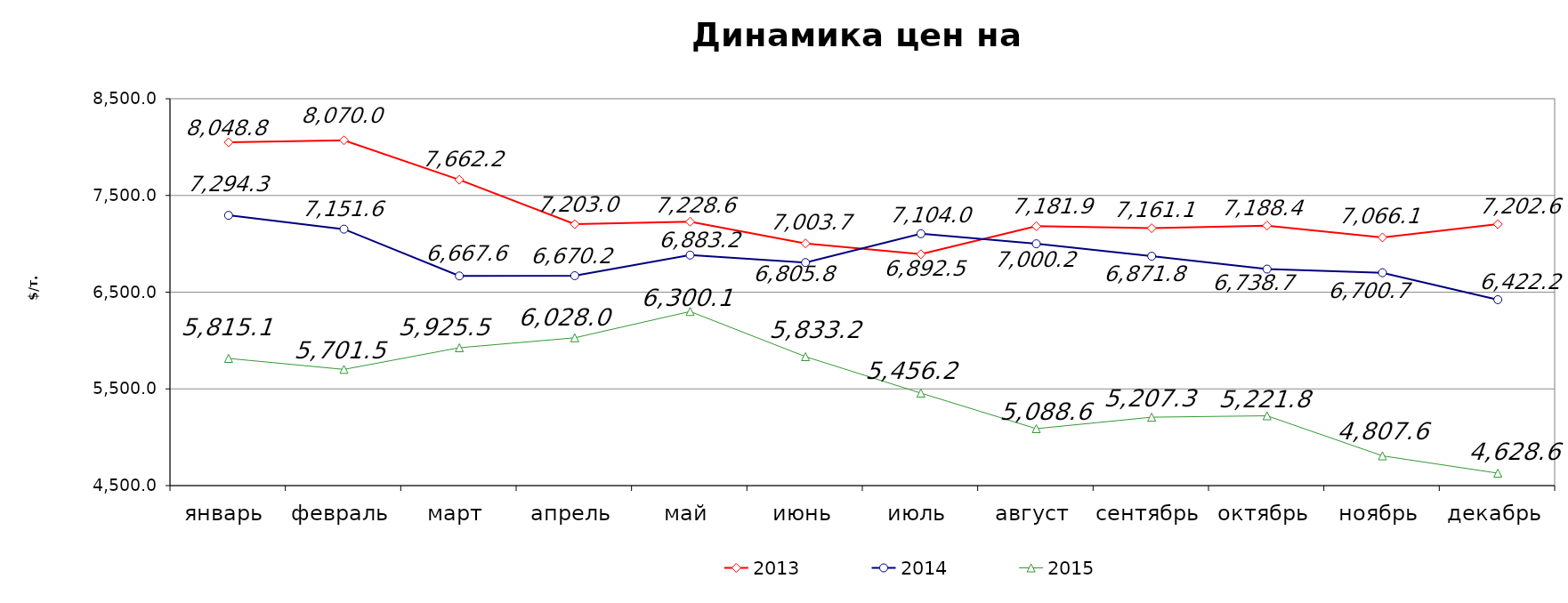
| Category | 2013 | 2014 | 2015 |
|---|---|---|---|
| январь | 8048.771 | 7294.328 | 5815.07 |
| февраль | 8070.02 | 7151.58 | 5701.487 |
| март | 7662.24 | 6667.56 | 5925.455 |
| апрель | 7202.97 | 6670.24 | 6027.97 |
| май | 7228.62 | 6883.15 | 6300.078 |
| июнь | 7003.715 | 6805.8 | 5833.217 |
| июль | 6892.509 | 7104.02 | 5456.217 |
| август | 7181.88 | 7000.175 | 5088.56 |
| сентябрь | 7161.11 | 6871.829 | 5207.32 |
| октябрь | 7188.38 | 6738.73 | 5221.81 |
| ноябрь | 7066.06 | 6700.67 | 4807.629 |
| декабрь | 7202.55 | 6422.23 | 4628.595 |